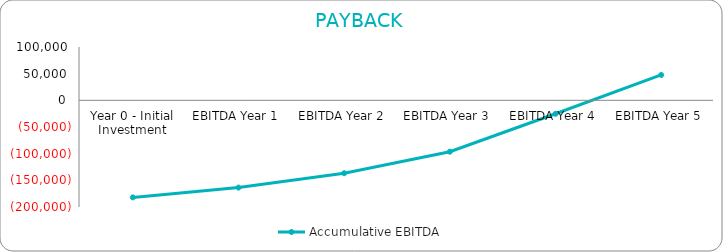
| Category | Accumulative EBITDA |
|---|---|
| Year 0 - Initial Investment | -181994 |
| EBITDA Year 1 | -163577.143 |
| EBITDA Year 2 | -136661.226 |
| EBITDA Year 3 | -96297.791 |
| EBITDA Year 4 | -25208.125 |
| EBITDA Year 5 | 47563.29 |